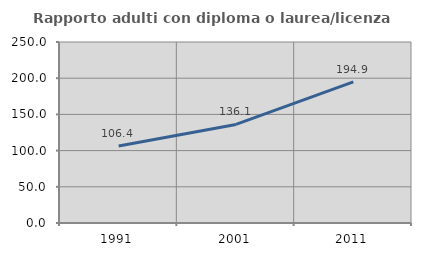
| Category | Rapporto adulti con diploma o laurea/licenza media  |
|---|---|
| 1991.0 | 106.367 |
| 2001.0 | 136.117 |
| 2011.0 | 194.898 |